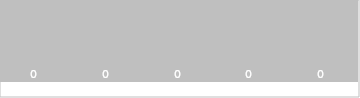
| Category | Basic graphical analysis |
|---|---|
| 0 | 0 |
| 1 | 0 |
| 2 | 0 |
| 3 | 0 |
| 4 | 0 |